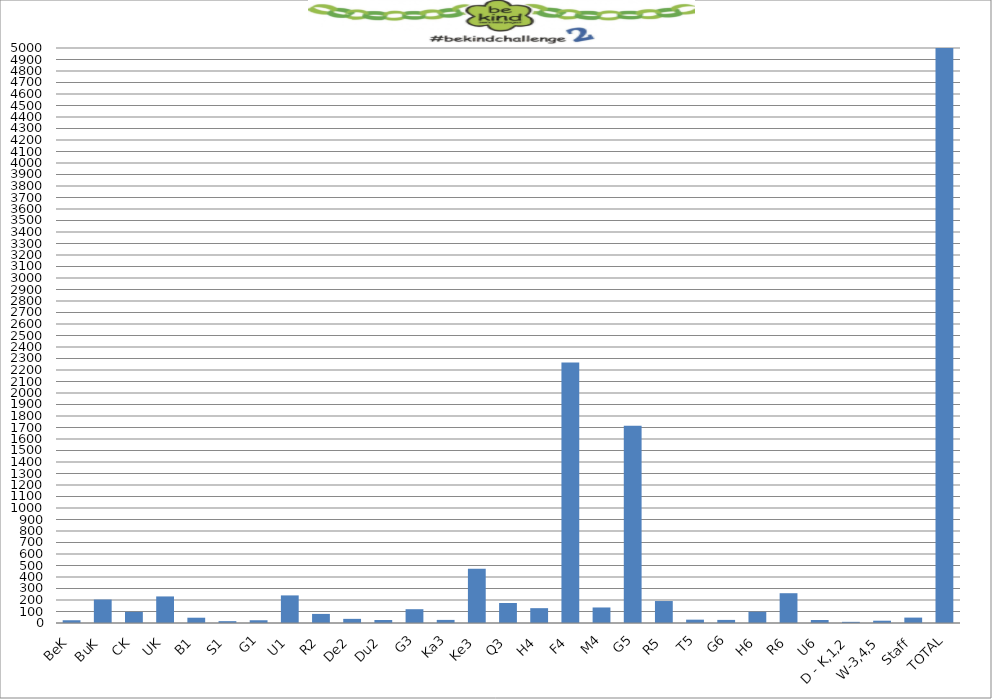
| Category | Series 0 |
|---|---|
| BeK | 24 |
| BuK | 204 |
| CK | 97 |
| UK | 231 |
| B1 | 46 |
| S1 | 16 |
| G1 | 24 |
| U1 | 240 |
| R2 | 79 |
| De2 | 36 |
| Du2 | 26 |
| G3 | 120 |
| Ka3 | 27 |
| Ke3 | 472 |
| Q3 | 174 |
| H4 | 129 |
| F4 | 2266 |
| M4 | 135 |
| G5 | 1715 |
| R5 | 191 |
| T5 | 29 |
| G6 | 27 |
| H6 | 98 |
| R6 | 259 |
| U6 | 26 |
| D - K,1,2 | 10 |
| W-3,4,5 | 20 |
| Staff | 47 |
| TOTAL | 6768 |